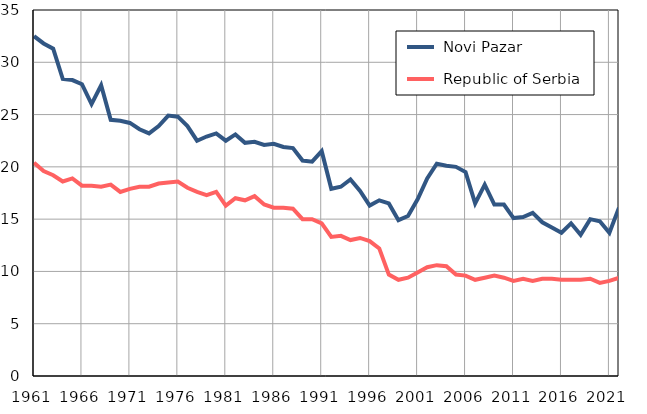
| Category |  Novi Pazar |  Republic of Serbia |
|---|---|---|
| 1961.0 | 32.5 | 20.4 |
| 1962.0 | 31.8 | 19.6 |
| 1963.0 | 31.3 | 19.2 |
| 1964.0 | 28.4 | 18.6 |
| 1965.0 | 28.3 | 18.9 |
| 1966.0 | 27.9 | 18.2 |
| 1967.0 | 26 | 18.2 |
| 1968.0 | 27.8 | 18.1 |
| 1969.0 | 24.5 | 18.3 |
| 1970.0 | 24.4 | 17.6 |
| 1971.0 | 24.2 | 17.9 |
| 1972.0 | 23.6 | 18.1 |
| 1973.0 | 23.2 | 18.1 |
| 1974.0 | 23.9 | 18.4 |
| 1975.0 | 24.9 | 18.5 |
| 1976.0 | 24.8 | 18.6 |
| 1977.0 | 23.9 | 18 |
| 1978.0 | 22.5 | 17.6 |
| 1979.0 | 22.9 | 17.3 |
| 1980.0 | 23.2 | 17.6 |
| 1981.0 | 22.5 | 16.3 |
| 1982.0 | 23.1 | 17 |
| 1983.0 | 22.3 | 16.8 |
| 1984.0 | 22.4 | 17.2 |
| 1985.0 | 22.1 | 16.4 |
| 1986.0 | 22.2 | 16.1 |
| 1987.0 | 21.9 | 16.1 |
| 1988.0 | 21.8 | 16 |
| 1989.0 | 20.6 | 15 |
| 1990.0 | 20.5 | 15 |
| 1991.0 | 21.5 | 14.6 |
| 1992.0 | 17.9 | 13.3 |
| 1993.0 | 18.1 | 13.4 |
| 1994.0 | 18.8 | 13 |
| 1995.0 | 17.7 | 13.2 |
| 1996.0 | 16.3 | 12.9 |
| 1997.0 | 16.8 | 12.2 |
| 1998.0 | 16.5 | 9.7 |
| 1999.0 | 14.9 | 9.2 |
| 2000.0 | 15.3 | 9.4 |
| 2001.0 | 16.9 | 9.9 |
| 2002.0 | 18.9 | 10.4 |
| 2003.0 | 20.3 | 10.6 |
| 2004.0 | 20.1 | 10.5 |
| 2005.0 | 20 | 9.7 |
| 2006.0 | 19.5 | 9.6 |
| 2007.0 | 16.5 | 9.2 |
| 2008.0 | 18.3 | 9.4 |
| 2009.0 | 16.4 | 9.6 |
| 2010.0 | 16.4 | 9.4 |
| 2011.0 | 15.1 | 9.1 |
| 2012.0 | 15.2 | 9.3 |
| 2013.0 | 15.6 | 9.1 |
| 2014.0 | 14.7 | 9.3 |
| 2015.0 | 14.2 | 9.3 |
| 2016.0 | 13.7 | 9.2 |
| 2017.0 | 14.6 | 9.2 |
| 2018.0 | 13.5 | 9.2 |
| 2019.0 | 15 | 9.3 |
| 2020.0 | 14.8 | 8.9 |
| 2021.0 | 13.7 | 9.1 |
| 2022.0 | 16.1 | 9.4 |